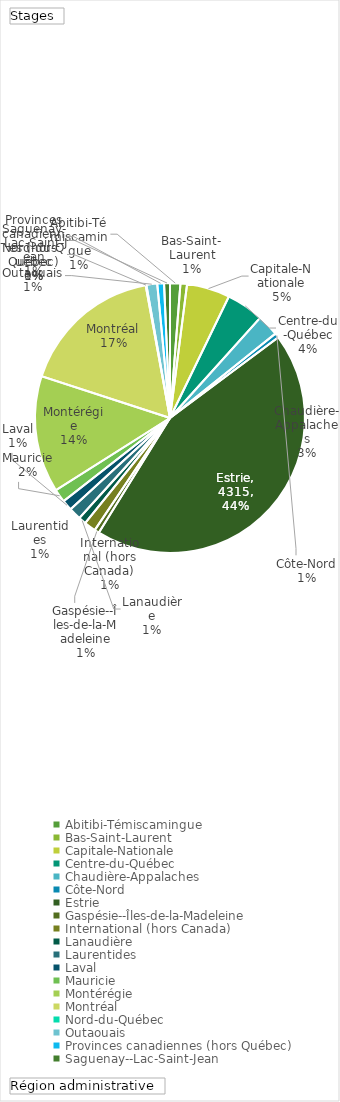
| Category | Total |
|---|---|
| Abitibi-Témiscamingue | 121 |
| Bas-Saint-Laurent | 77 |
| Capitale-Nationale | 506 |
| Centre-du-Québec | 439 |
| Chaudière-Appalaches | 254 |
| Côte-Nord | 54 |
| Estrie | 4315 |
| Gaspésie--Îles-de-la-Madeleine | 56 |
| International (hors Canada) | 138 |
| Lanaudière | 88 |
| Laurentides | 144 |
| Laval | 123 |
| Mauricie | 155 |
| Montérégie | 1371 |
| Montréal | 1676 |
| Nord-du-Québec | 9 |
| Outaouais | 126 |
| Provinces canadiennes (hors Québec) | 79 |
| Saguenay--Lac-Saint-Jean | 69 |